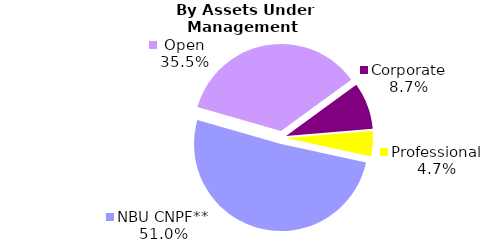
| Category | Series 0 |
|---|---|
| Open | 882.768 |
| Corporate | 216.417 |
| Professional | 117.366 |
| NBU CNPF** | 1268.649 |